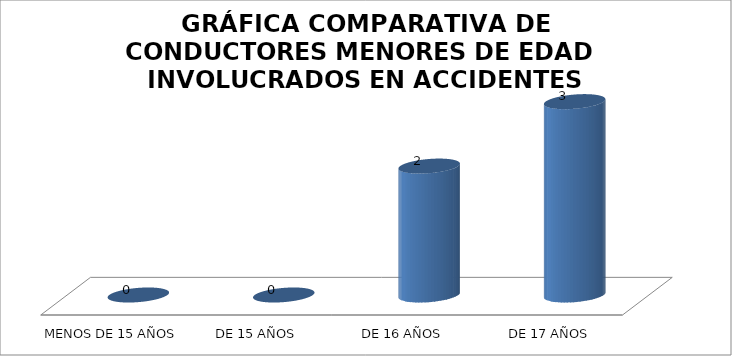
| Category | Series 0 |
|---|---|
| MENOS DE 15 AÑOS | 0 |
| DE 15 AÑOS | 0 |
| DE 16 AÑOS | 2 |
|  DE 17 AÑOS | 3 |